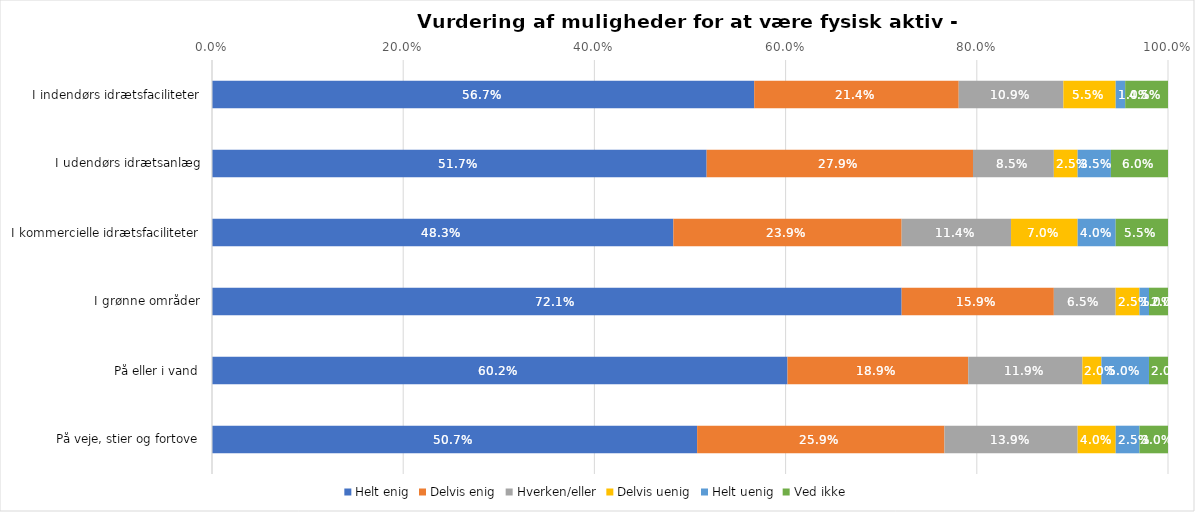
| Category | Helt enig | Delvis enig | Hverken/eller | Delvis uenig | Helt uenig | Ved ikke |
|---|---|---|---|---|---|---|
| I indendørs idrætsfaciliteter | 0.567 | 0.214 | 0.109 | 0.055 | 0.01 | 0.045 |
| I udendørs idrætsanlæg | 0.517 | 0.279 | 0.085 | 0.025 | 0.035 | 0.06 |
| I kommercielle idrætsfaciliteter | 0.483 | 0.239 | 0.114 | 0.07 | 0.04 | 0.055 |
| I grønne områder | 0.721 | 0.159 | 0.065 | 0.025 | 0.01 | 0.02 |
| På eller i vand | 0.602 | 0.189 | 0.119 | 0.02 | 0.05 | 0.02 |
| På veje, stier og fortove | 0.507 | 0.259 | 0.139 | 0.04 | 0.025 | 0.03 |